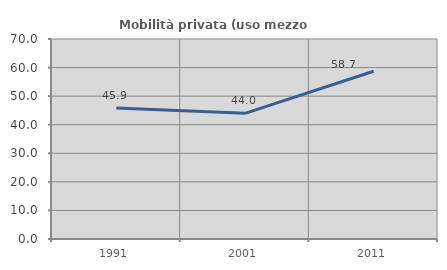
| Category | Mobilità privata (uso mezzo privato) |
|---|---|
| 1991.0 | 45.879 |
| 2001.0 | 43.991 |
| 2011.0 | 58.73 |